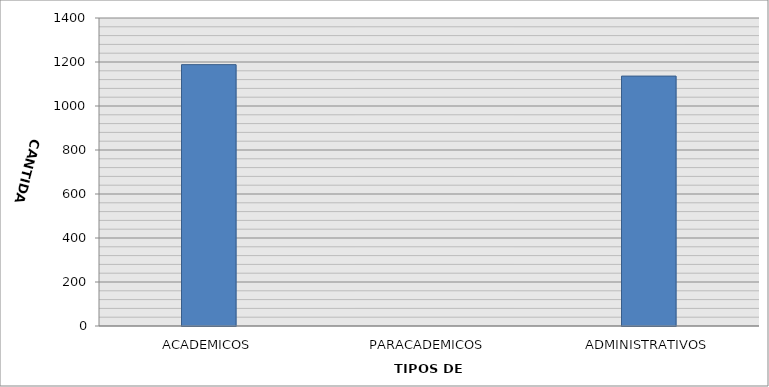
| Category | CANTIDAD |
|---|---|
| ACADEMICOS | 1188 |
| PARACADEMICOS | 0 |
| ADMINISTRATIVOS | 1136 |